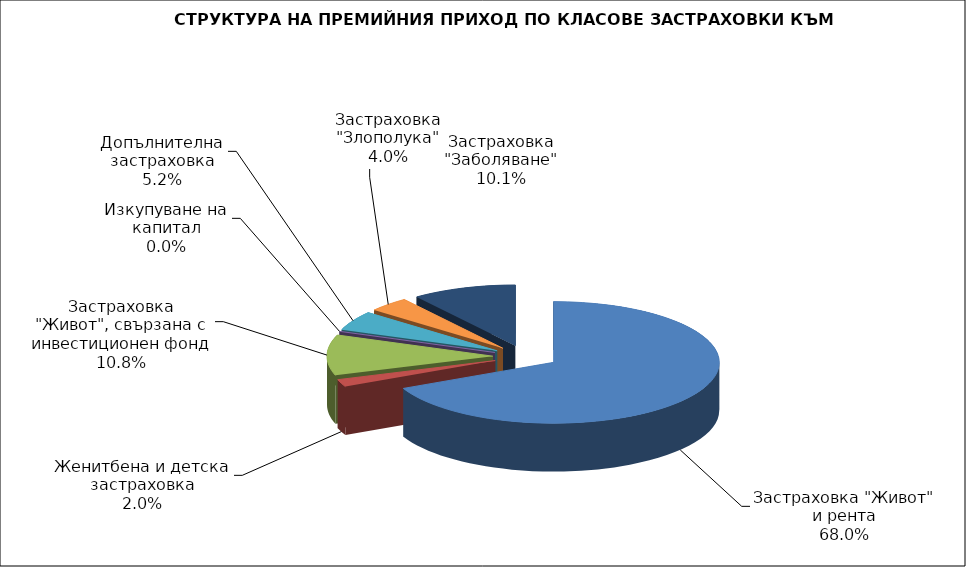
| Category | Series 0 |
|---|---|
| Застраховка "Живот" и рента | 133268156.632 |
| Женитбена и детска застраховка | 3834266.735 |
| Застраховка "Живот", свързана с инвестиционен фонд | 21105156.96 |
| Изкупуване на капитал | 0 |
| Допълнителна застраховка | 10128572.668 |
| Застраховка "Злополука" | 7894232.63 |
| Застраховка "Заболяване" | 19895555.83 |